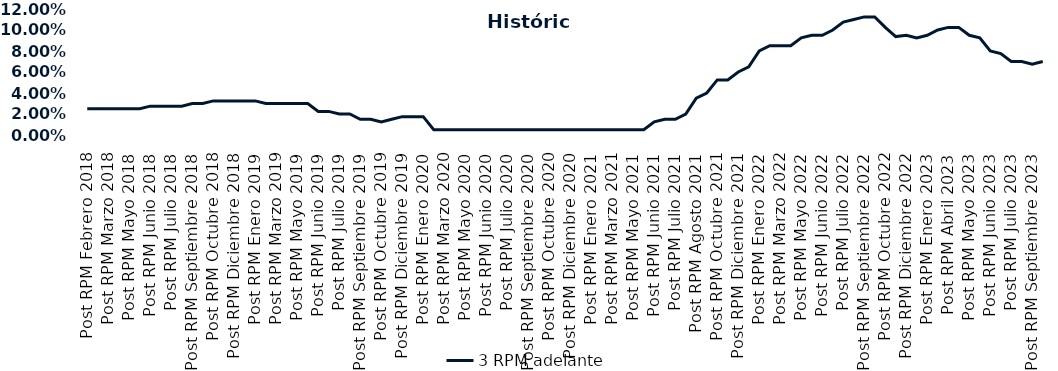
| Category | 3 RPM adelante |
|---|---|
| Post RPM Febrero 2018 | 0.025 |
| Pre RPM Marzo 2018 | 0.025 |
| Post RPM Marzo 2018 | 0.025 |
| Pre RPM Mayo 2018 | 0.025 |
| Post RPM Mayo 2018 | 0.025 |
| Pre RPM Junio 2018 | 0.025 |
| Post RPM Junio 2018 | 0.028 |
| Pre RPM Julio 2018 | 0.028 |
| Post RPM Julio 2018 | 0.028 |
| Pre RPM Septiembre 2018 | 0.028 |
| Post RPM Septiembre 2018 | 0.03 |
| Pre RPM Octubre 2018 | 0.03 |
| Post RPM Octubre 2018 | 0.032 |
| Pre RPM Diciembre 2018 | 0.032 |
| Post RPM Diciembre 2018 | 0.032 |
| Pre RPM Enero 2019 | 0.032 |
| Post RPM Enero 2019 | 0.032 |
| Pre RPM Marzo 2019 | 0.03 |
| Post RPM Marzo 2019 | 0.03 |
| Pre RPM Mayo 2019 | 0.03 |
| Post RPM Mayo 2019 | 0.03 |
| Pre RPM Junio 2019 | 0.03 |
| Post RPM Junio 2019 | 0.022 |
| Pre RPM Julio 2019 | 0.022 |
| Post RPM Julio 2019 | 0.02 |
| Pre RPM Septiembre 2019 | 0.02 |
| Post RPM Septiembre 2019 | 0.015 |
| Pre RPM Octubre 2019 | 0.015 |
| Post RPM Octubre 2019 | 0.012 |
| Pre RPM Diciembre 2019 | 0.015 |
| Post RPM Diciembre 2019 | 0.018 |
| Pre RPM Enero 2020 | 0.018 |
| Post RPM Enero 2020 | 0.018 |
| Pre RPM Marzo 2020 | 0.005 |
| Post RPM Marzo 2020 | 0.005 |
| Pre RPM Mayo 2020 | 0.005 |
| Post RPM Mayo 2020 | 0.005 |
| Pre RPM Junio 2020 | 0.005 |
| Post RPM Junio 2020 | 0.005 |
| Pre RPM Julio 2020 | 0.005 |
| Post RPM Julio 2020 | 0.005 |
| Pre RPM Septiembre 2020 | 0.005 |
| Post RPM Septiembre 2020 | 0.005 |
| Pre RPM Octubre 2020 | 0.005 |
| Post RPM Octubre 2020 | 0.005 |
| Pre RPM Diciembre 2020 | 0.005 |
| Post RPM Diciembre 2020 | 0.005 |
| Pre RPM Enero 2021 | 0.005 |
| Post RPM Enero 2021 | 0.005 |
| Pre RPM Marzo 2021 | 0.005 |
| Post RPM Marzo 2021 | 0.005 |
| Pre RPM Mayo 2021 | 0.005 |
| Post RPM Mayo 2021 | 0.005 |
| Pre RPM Junio 2021 | 0.005 |
| Post RPM Junio 2021 | 0.012 |
| Pre RPM Julio 2021 | 0.015 |
| Post RPM Julio 2021 | 0.015 |
| Pre RPM Agosto 2021 | 0.02 |
| Post RPM Agosto 2021 | 0.035 |
| Pre RPM Octubre 2021 | 0.04 |
| Post RPM Octubre 2021 | 0.052 |
| Pre RPM Diciembre 2021 | 0.052 |
| Post RPM Diciembre 2021 | 0.06 |
| Pre RPM Enero 2022 | 0.065 |
| Post RPM Enero 2022 | 0.08 |
| Pre RPM Marzo 2022 | 0.085 |
| Post RPM Marzo 2022 | 0.085 |
| Pre RPM Mayo 2022 | 0.085 |
| Post RPM Mayo 2022 | 0.092 |
| Pre RPM Junio 2022 | 0.095 |
| Post RPM Junio 2022 | 0.095 |
| Pre RPM Julio 2022 | 0.1 |
| Post RPM Julio 2022 | 0.108 |
| Pre RPM Septiembre 2022 | 0.11 |
| Post RPM Septiembre 2022 | 0.112 |
| Pre RPM Octubre 2022 | 0.112 |
| Post RPM Octubre 2022 | 0.102 |
| Pre RPM Diciembre 2022 | 0.094 |
| Post RPM Diciembre 2022 | 0.095 |
| Pre RPM Enero 2023 | 0.092 |
| Post RPM Enero 2023 | 0.095 |
| Pre RPM Abril 2023 | 0.1 |
| Post RPM Abril 2023 | 0.102 |
| Pre RPM Mayo 2023 | 0.102 |
| Post RPM Mayo 2023 | 0.095 |
| Pre RPM Junio 2023 | 0.092 |
| Post RPM Junio 2023 | 0.08 |
| Pre RPM Julio 2023 | 0.078 |
| Post RPM Julio 2023 | 0.07 |
| Pre RPM Septiembre 2023 | 0.07 |
| Post RPM Septiembre 2023 | 0.068 |
| Pre RPM Octubre 2023 | 0.07 |